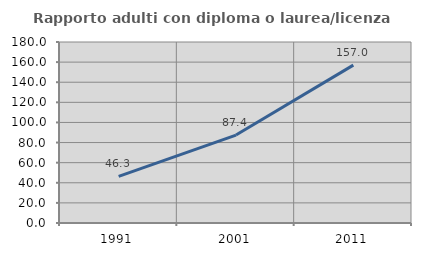
| Category | Rapporto adulti con diploma o laurea/licenza media  |
|---|---|
| 1991.0 | 46.316 |
| 2001.0 | 87.438 |
| 2011.0 | 156.974 |